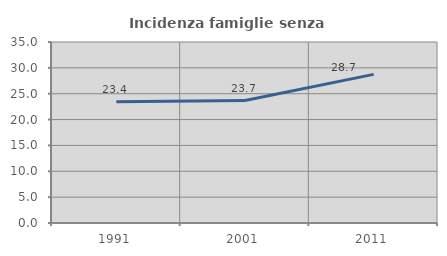
| Category | Incidenza famiglie senza nuclei |
|---|---|
| 1991.0 | 23.45 |
| 2001.0 | 23.685 |
| 2011.0 | 28.742 |